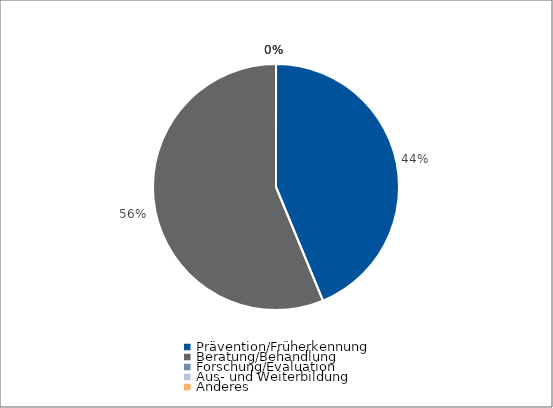
| Category | Series 0 |
|---|---|
| Prävention/Früherkennung | 140052 |
| Beratung/Behandlung | 180000 |
| Forschung/Evaluation | 0 |
| Aus- und Weiterbildung | 0 |
| Anderes | 0 |